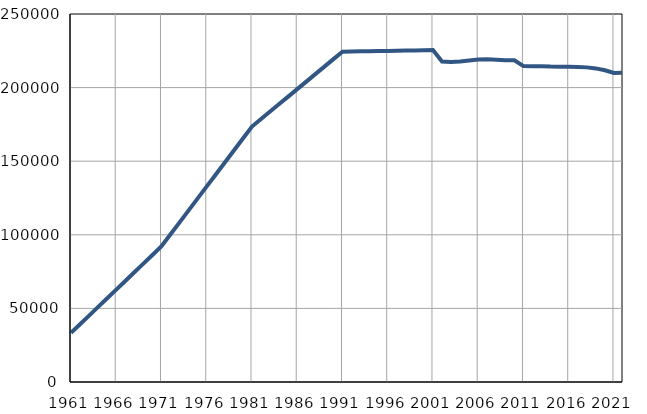
| Category | Број
становника |
|---|---|
| 1961.0 | 33347 |
| 1962.0 | 39232 |
| 1963.0 | 45118 |
| 1964.0 | 51003 |
| 1965.0 | 56888 |
| 1966.0 | 62773 |
| 1967.0 | 68659 |
| 1968.0 | 74544 |
| 1969.0 | 80429 |
| 1970.0 | 86315 |
| 1971.0 | 92200 |
| 1972.0 | 100334 |
| 1973.0 | 108468 |
| 1974.0 | 116602 |
| 1975.0 | 124736 |
| 1976.0 | 132871 |
| 1977.0 | 141005 |
| 1978.0 | 149138 |
| 1979.0 | 157273 |
| 1980.0 | 165407 |
| 1981.0 | 173541 |
| 1982.0 | 178629 |
| 1983.0 | 183718 |
| 1984.0 | 188806 |
| 1985.0 | 193894 |
| 1986.0 | 198983 |
| 1987.0 | 204071 |
| 1988.0 | 209159 |
| 1989.0 | 214247 |
| 1990.0 | 219336 |
| 1991.0 | 224424 |
| 1992.0 | 224529 |
| 1993.0 | 224633 |
| 1994.0 | 224738 |
| 1995.0 | 224843 |
| 1996.0 | 224947 |
| 1997.0 | 225052 |
| 1998.0 | 225156 |
| 1999.0 | 225261 |
| 2000.0 | 225366 |
| 2001.0 | 225470 |
| 2002.0 | 217706 |
| 2003.0 | 217361 |
| 2004.0 | 217706 |
| 2005.0 | 218439 |
| 2006.0 | 219012 |
| 2007.0 | 219208 |
| 2008.0 | 218977 |
| 2009.0 | 218593 |
| 2010.0 | 218504 |
| 2011.0 | 214587 |
| 2012.0 | 214466 |
| 2013.0 | 214512 |
| 2014.0 | 214277 |
| 2015.0 | 214229 |
| 2016.0 | 214132 |
| 2017.0 | 213985 |
| 2018.0 | 213742 |
| 2019.0 | 213040 |
| 2020.0 | 211788 |
| 2021.0 | 209941 |
| 2022.0 | 210191 |